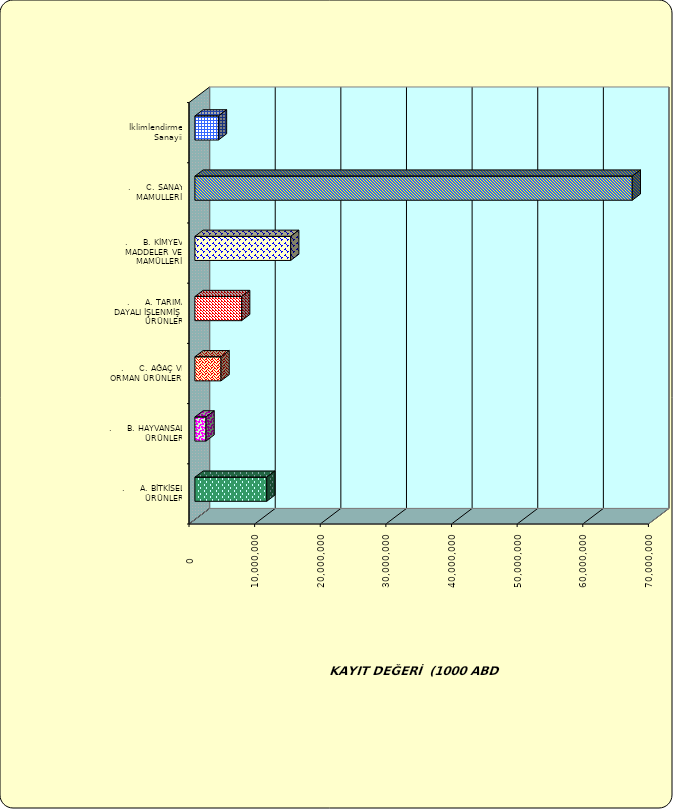
| Category | Series 0 |
|---|---|
| .     A. BİTKİSEL ÜRÜNLER | 10950144.476 |
| .     B. HAYVANSAL ÜRÜNLER | 1695332.448 |
| .     C. AĞAÇ VE ORMAN ÜRÜNLERİ | 3982101.148 |
| .     A. TARIMA DAYALI İŞLENMİŞ ÜRÜNLER | 7119893.751 |
| .     B. KİMYEVİ MADDELER VE MAMÜLLERİ | 14593613.579 |
| .     C. SANAYİ MAMULLERİ | 66643800.893 |
|  İklimlendirme Sanayii | 3586517.114 |